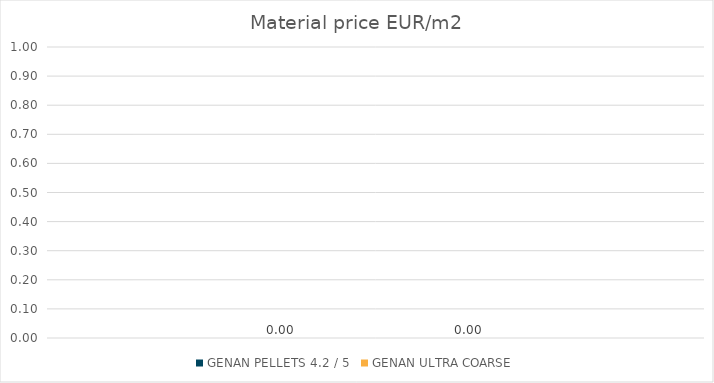
| Category | GENAN PELLETS 4.2 / 5  | GENAN ULTRA COARSE |
|---|---|---|
| 0 | 0 | 0 |